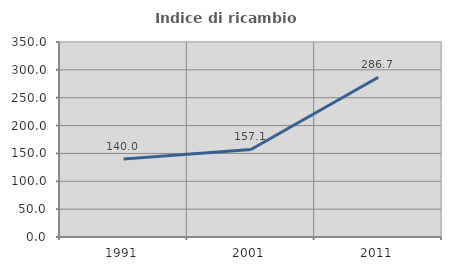
| Category | Indice di ricambio occupazionale  |
|---|---|
| 1991.0 | 140 |
| 2001.0 | 157.143 |
| 2011.0 | 286.667 |